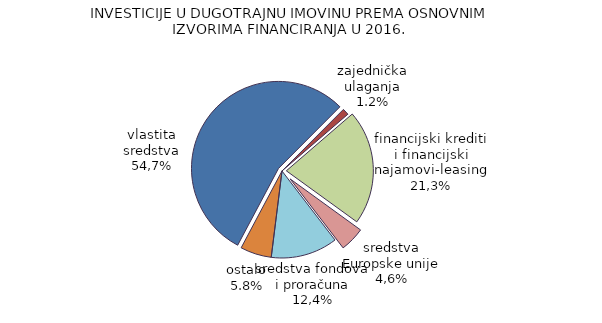
| Category | Series 0 |
|---|---|
| vlastita sredstva | 54.7 |
| zajednička ulaganja | 1.2 |
| financijski krediti i financijski najamovi-leasing | 21.3 |
| sredstva Europske unije | 4.6 |
| sredstva fondova i proračuna | 12.4 |
| ostalo | 5.8 |